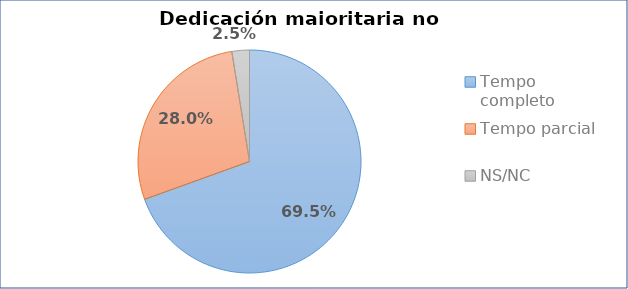
| Category | Dedicación maioritaria |
|---|---|
| Tempo completo | 0.695 |
| Tempo parcial | 0.28 |
| NS/NC | 0.025 |